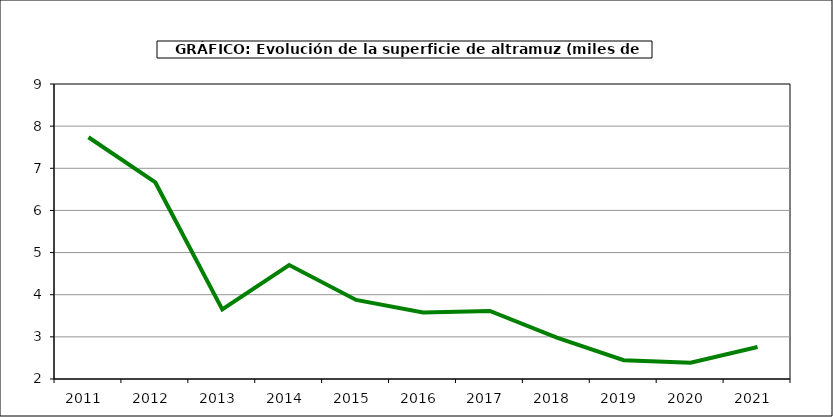
| Category | Superficie |
|---|---|
| 2011.0 | 7.736 |
| 2012.0 | 6.664 |
| 2013.0 | 3.65 |
| 2014.0 | 4.706 |
| 2015.0 | 3.876 |
| 2016.0 | 3.577 |
| 2017.0 | 3.614 |
| 2018.0 | 2.984 |
| 2019.0 | 2.445 |
| 2020.0 | 2.386 |
| 2021.0 | 2.759 |